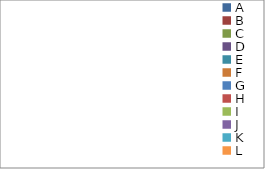
| Category | Series 0 |
|---|---|
| A | 0 |
| B | 0 |
| C | 0 |
| D | 0 |
| E | 0 |
| F | 0 |
| G | 0 |
| H | 0 |
| I | 0 |
| J | 0 |
| K | 0 |
| L | 0 |